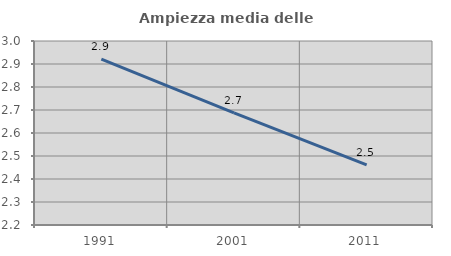
| Category | Ampiezza media delle famiglie |
|---|---|
| 1991.0 | 2.921 |
| 2001.0 | 2.688 |
| 2011.0 | 2.462 |